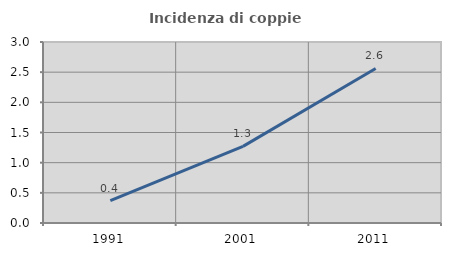
| Category | Incidenza di coppie miste |
|---|---|
| 1991.0 | 0.37 |
| 2001.0 | 1.27 |
| 2011.0 | 2.561 |